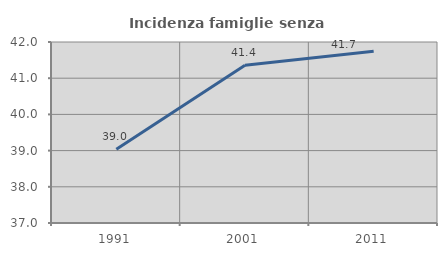
| Category | Incidenza famiglie senza nuclei |
|---|---|
| 1991.0 | 39.039 |
| 2001.0 | 41.358 |
| 2011.0 | 41.748 |